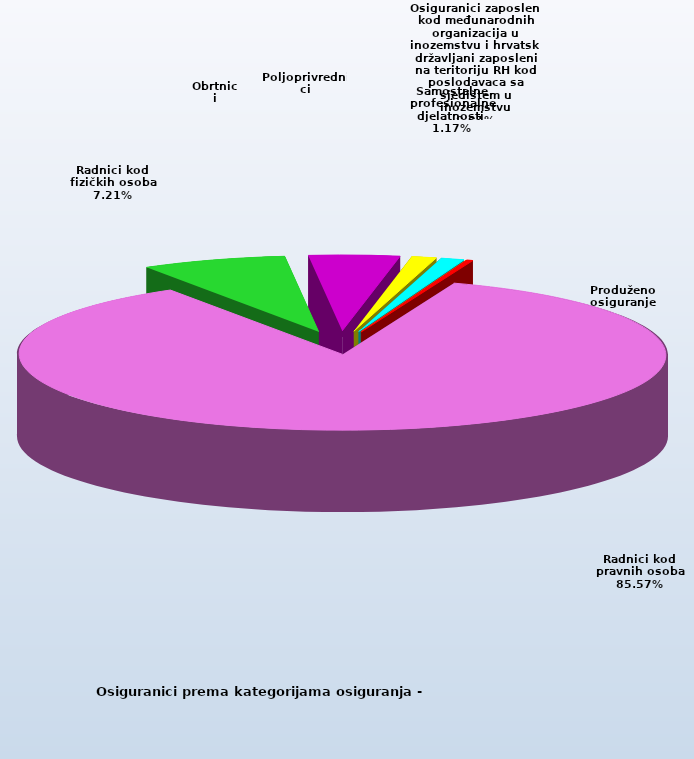
| Category | Series 0 |
|---|---|
| Radnici kod pravnih osoba | 1329722 |
| Radnici kod fizičkih osoba | 111976 |
| Obrtnici | 70072 |
| Poljoprivrednici | 19176 |
| Samostalne profesionalne djelatnosti  | 18154 |
| Osiguranici zaposleni kod međunarodnih organizacija u inozemstvu i hrvatski državljani zaposleni na teritoriju RH kod poslodavaca sa sjedištem u inozemstvu | 78 |
| Produženo osiguranje | 4701 |